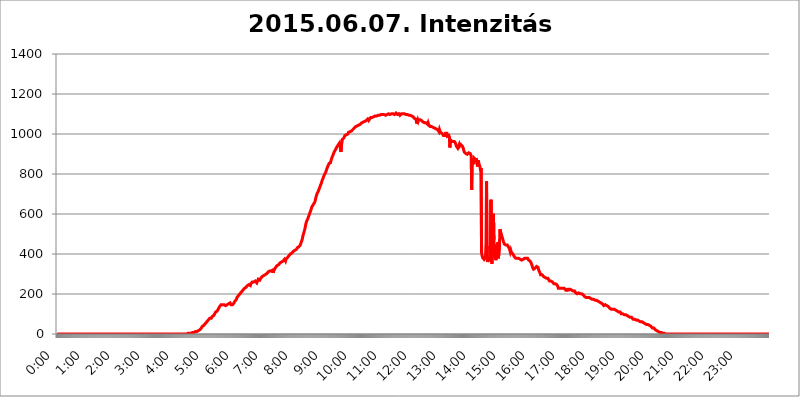
| Category | 2015.06.07. Intenzitás [W/m^2] |
|---|---|
| 0.0 | 0 |
| 0.0006944444444444445 | 0 |
| 0.001388888888888889 | 0 |
| 0.0020833333333333333 | 0 |
| 0.002777777777777778 | 0 |
| 0.003472222222222222 | 0 |
| 0.004166666666666667 | 0 |
| 0.004861111111111111 | 0 |
| 0.005555555555555556 | 0 |
| 0.0062499999999999995 | 0 |
| 0.006944444444444444 | 0 |
| 0.007638888888888889 | 0 |
| 0.008333333333333333 | 0 |
| 0.009027777777777779 | 0 |
| 0.009722222222222222 | 0 |
| 0.010416666666666666 | 0 |
| 0.011111111111111112 | 0 |
| 0.011805555555555555 | 0 |
| 0.012499999999999999 | 0 |
| 0.013194444444444444 | 0 |
| 0.013888888888888888 | 0 |
| 0.014583333333333332 | 0 |
| 0.015277777777777777 | 0 |
| 0.015972222222222224 | 0 |
| 0.016666666666666666 | 0 |
| 0.017361111111111112 | 0 |
| 0.018055555555555557 | 0 |
| 0.01875 | 0 |
| 0.019444444444444445 | 0 |
| 0.02013888888888889 | 0 |
| 0.020833333333333332 | 0 |
| 0.02152777777777778 | 0 |
| 0.022222222222222223 | 0 |
| 0.02291666666666667 | 0 |
| 0.02361111111111111 | 0 |
| 0.024305555555555556 | 0 |
| 0.024999999999999998 | 0 |
| 0.025694444444444447 | 0 |
| 0.02638888888888889 | 0 |
| 0.027083333333333334 | 0 |
| 0.027777777777777776 | 0 |
| 0.02847222222222222 | 0 |
| 0.029166666666666664 | 0 |
| 0.029861111111111113 | 0 |
| 0.030555555555555555 | 0 |
| 0.03125 | 0 |
| 0.03194444444444445 | 0 |
| 0.03263888888888889 | 0 |
| 0.03333333333333333 | 0 |
| 0.034027777777777775 | 0 |
| 0.034722222222222224 | 0 |
| 0.035416666666666666 | 0 |
| 0.036111111111111115 | 0 |
| 0.03680555555555556 | 0 |
| 0.0375 | 0 |
| 0.03819444444444444 | 0 |
| 0.03888888888888889 | 0 |
| 0.03958333333333333 | 0 |
| 0.04027777777777778 | 0 |
| 0.04097222222222222 | 0 |
| 0.041666666666666664 | 0 |
| 0.042361111111111106 | 0 |
| 0.04305555555555556 | 0 |
| 0.043750000000000004 | 0 |
| 0.044444444444444446 | 0 |
| 0.04513888888888889 | 0 |
| 0.04583333333333334 | 0 |
| 0.04652777777777778 | 0 |
| 0.04722222222222222 | 0 |
| 0.04791666666666666 | 0 |
| 0.04861111111111111 | 0 |
| 0.049305555555555554 | 0 |
| 0.049999999999999996 | 0 |
| 0.05069444444444445 | 0 |
| 0.051388888888888894 | 0 |
| 0.052083333333333336 | 0 |
| 0.05277777777777778 | 0 |
| 0.05347222222222222 | 0 |
| 0.05416666666666667 | 0 |
| 0.05486111111111111 | 0 |
| 0.05555555555555555 | 0 |
| 0.05625 | 0 |
| 0.05694444444444444 | 0 |
| 0.057638888888888885 | 0 |
| 0.05833333333333333 | 0 |
| 0.05902777777777778 | 0 |
| 0.059722222222222225 | 0 |
| 0.06041666666666667 | 0 |
| 0.061111111111111116 | 0 |
| 0.06180555555555556 | 0 |
| 0.0625 | 0 |
| 0.06319444444444444 | 0 |
| 0.06388888888888888 | 0 |
| 0.06458333333333334 | 0 |
| 0.06527777777777778 | 0 |
| 0.06597222222222222 | 0 |
| 0.06666666666666667 | 0 |
| 0.06736111111111111 | 0 |
| 0.06805555555555555 | 0 |
| 0.06874999999999999 | 0 |
| 0.06944444444444443 | 0 |
| 0.07013888888888889 | 0 |
| 0.07083333333333333 | 0 |
| 0.07152777777777779 | 0 |
| 0.07222222222222223 | 0 |
| 0.07291666666666667 | 0 |
| 0.07361111111111111 | 0 |
| 0.07430555555555556 | 0 |
| 0.075 | 0 |
| 0.07569444444444444 | 0 |
| 0.0763888888888889 | 0 |
| 0.07708333333333334 | 0 |
| 0.07777777777777778 | 0 |
| 0.07847222222222222 | 0 |
| 0.07916666666666666 | 0 |
| 0.0798611111111111 | 0 |
| 0.08055555555555556 | 0 |
| 0.08125 | 0 |
| 0.08194444444444444 | 0 |
| 0.08263888888888889 | 0 |
| 0.08333333333333333 | 0 |
| 0.08402777777777777 | 0 |
| 0.08472222222222221 | 0 |
| 0.08541666666666665 | 0 |
| 0.08611111111111112 | 0 |
| 0.08680555555555557 | 0 |
| 0.08750000000000001 | 0 |
| 0.08819444444444445 | 0 |
| 0.08888888888888889 | 0 |
| 0.08958333333333333 | 0 |
| 0.09027777777777778 | 0 |
| 0.09097222222222222 | 0 |
| 0.09166666666666667 | 0 |
| 0.09236111111111112 | 0 |
| 0.09305555555555556 | 0 |
| 0.09375 | 0 |
| 0.09444444444444444 | 0 |
| 0.09513888888888888 | 0 |
| 0.09583333333333333 | 0 |
| 0.09652777777777777 | 0 |
| 0.09722222222222222 | 0 |
| 0.09791666666666667 | 0 |
| 0.09861111111111111 | 0 |
| 0.09930555555555555 | 0 |
| 0.09999999999999999 | 0 |
| 0.10069444444444443 | 0 |
| 0.1013888888888889 | 0 |
| 0.10208333333333335 | 0 |
| 0.10277777777777779 | 0 |
| 0.10347222222222223 | 0 |
| 0.10416666666666667 | 0 |
| 0.10486111111111111 | 0 |
| 0.10555555555555556 | 0 |
| 0.10625 | 0 |
| 0.10694444444444444 | 0 |
| 0.1076388888888889 | 0 |
| 0.10833333333333334 | 0 |
| 0.10902777777777778 | 0 |
| 0.10972222222222222 | 0 |
| 0.1111111111111111 | 0 |
| 0.11180555555555556 | 0 |
| 0.11180555555555556 | 0 |
| 0.1125 | 0 |
| 0.11319444444444444 | 0 |
| 0.11388888888888889 | 0 |
| 0.11458333333333333 | 0 |
| 0.11527777777777777 | 0 |
| 0.11597222222222221 | 0 |
| 0.11666666666666665 | 0 |
| 0.1173611111111111 | 0 |
| 0.11805555555555557 | 0 |
| 0.11944444444444445 | 0 |
| 0.12013888888888889 | 0 |
| 0.12083333333333333 | 0 |
| 0.12152777777777778 | 0 |
| 0.12222222222222223 | 0 |
| 0.12291666666666667 | 0 |
| 0.12291666666666667 | 0 |
| 0.12361111111111112 | 0 |
| 0.12430555555555556 | 0 |
| 0.125 | 0 |
| 0.12569444444444444 | 0 |
| 0.12638888888888888 | 0 |
| 0.12708333333333333 | 0 |
| 0.16875 | 0 |
| 0.12847222222222224 | 0 |
| 0.12916666666666668 | 0 |
| 0.12986111111111112 | 0 |
| 0.13055555555555556 | 0 |
| 0.13125 | 0 |
| 0.13194444444444445 | 0 |
| 0.1326388888888889 | 0 |
| 0.13333333333333333 | 0 |
| 0.13402777777777777 | 0 |
| 0.13402777777777777 | 0 |
| 0.13472222222222222 | 0 |
| 0.13541666666666666 | 0 |
| 0.1361111111111111 | 0 |
| 0.13749999999999998 | 0 |
| 0.13819444444444443 | 0 |
| 0.1388888888888889 | 0 |
| 0.13958333333333334 | 0 |
| 0.14027777777777778 | 0 |
| 0.14097222222222222 | 0 |
| 0.14166666666666666 | 0 |
| 0.1423611111111111 | 0 |
| 0.14305555555555557 | 0 |
| 0.14375000000000002 | 0 |
| 0.14444444444444446 | 0 |
| 0.1451388888888889 | 0 |
| 0.1451388888888889 | 0 |
| 0.14652777777777778 | 0 |
| 0.14722222222222223 | 0 |
| 0.14791666666666667 | 0 |
| 0.1486111111111111 | 0 |
| 0.14930555555555555 | 0 |
| 0.15 | 0 |
| 0.15069444444444444 | 0 |
| 0.15138888888888888 | 0 |
| 0.15208333333333332 | 0 |
| 0.15277777777777776 | 0 |
| 0.15347222222222223 | 0 |
| 0.15416666666666667 | 0 |
| 0.15486111111111112 | 0 |
| 0.15555555555555556 | 0 |
| 0.15625 | 0 |
| 0.15694444444444444 | 0 |
| 0.15763888888888888 | 0 |
| 0.15833333333333333 | 0 |
| 0.15902777777777777 | 0 |
| 0.15972222222222224 | 0 |
| 0.16041666666666668 | 0 |
| 0.16111111111111112 | 0 |
| 0.16180555555555556 | 0 |
| 0.1625 | 0 |
| 0.16319444444444445 | 0 |
| 0.1638888888888889 | 0 |
| 0.16458333333333333 | 0 |
| 0.16527777777777777 | 0 |
| 0.16597222222222222 | 0 |
| 0.16666666666666666 | 0 |
| 0.1673611111111111 | 0 |
| 0.16805555555555554 | 0 |
| 0.16874999999999998 | 0 |
| 0.16944444444444443 | 0 |
| 0.17013888888888887 | 0 |
| 0.1708333333333333 | 0 |
| 0.17152777777777775 | 0 |
| 0.17222222222222225 | 0 |
| 0.1729166666666667 | 0 |
| 0.17361111111111113 | 0 |
| 0.17430555555555557 | 0 |
| 0.17500000000000002 | 0 |
| 0.17569444444444446 | 0 |
| 0.1763888888888889 | 0 |
| 0.17708333333333334 | 0 |
| 0.17777777777777778 | 0 |
| 0.17847222222222223 | 0 |
| 0.17916666666666667 | 0 |
| 0.1798611111111111 | 0 |
| 0.18055555555555555 | 0 |
| 0.18125 | 0 |
| 0.18194444444444444 | 0 |
| 0.1826388888888889 | 0 |
| 0.18333333333333335 | 3.525 |
| 0.1840277777777778 | 3.525 |
| 0.18472222222222223 | 3.525 |
| 0.18541666666666667 | 3.525 |
| 0.18611111111111112 | 3.525 |
| 0.18680555555555556 | 3.525 |
| 0.1875 | 3.525 |
| 0.18819444444444444 | 3.525 |
| 0.18888888888888888 | 3.525 |
| 0.18958333333333333 | 7.887 |
| 0.19027777777777777 | 7.887 |
| 0.1909722222222222 | 7.887 |
| 0.19166666666666665 | 7.887 |
| 0.19236111111111112 | 7.887 |
| 0.19305555555555554 | 7.887 |
| 0.19375 | 12.257 |
| 0.19444444444444445 | 12.257 |
| 0.1951388888888889 | 12.257 |
| 0.19583333333333333 | 12.257 |
| 0.19652777777777777 | 16.636 |
| 0.19722222222222222 | 16.636 |
| 0.19791666666666666 | 16.636 |
| 0.1986111111111111 | 21.024 |
| 0.19930555555555554 | 21.024 |
| 0.19999999999999998 | 21.024 |
| 0.20069444444444443 | 21.024 |
| 0.20138888888888887 | 25.419 |
| 0.2020833333333333 | 29.823 |
| 0.2027777777777778 | 34.234 |
| 0.2034722222222222 | 38.653 |
| 0.2041666666666667 | 38.653 |
| 0.20486111111111113 | 43.079 |
| 0.20555555555555557 | 43.079 |
| 0.20625000000000002 | 47.511 |
| 0.20694444444444446 | 47.511 |
| 0.2076388888888889 | 51.951 |
| 0.20833333333333334 | 56.398 |
| 0.20902777777777778 | 56.398 |
| 0.20972222222222223 | 60.85 |
| 0.21041666666666667 | 65.31 |
| 0.2111111111111111 | 65.31 |
| 0.21180555555555555 | 69.775 |
| 0.2125 | 69.775 |
| 0.21319444444444444 | 74.246 |
| 0.2138888888888889 | 78.722 |
| 0.21458333333333335 | 78.722 |
| 0.2152777777777778 | 78.722 |
| 0.21597222222222223 | 78.722 |
| 0.21666666666666667 | 83.205 |
| 0.21736111111111112 | 87.692 |
| 0.21805555555555556 | 87.692 |
| 0.21875 | 87.692 |
| 0.21944444444444444 | 92.184 |
| 0.22013888888888888 | 96.682 |
| 0.22083333333333333 | 101.184 |
| 0.22152777777777777 | 105.69 |
| 0.2222222222222222 | 110.201 |
| 0.22291666666666665 | 110.201 |
| 0.2236111111111111 | 114.716 |
| 0.22430555555555556 | 114.716 |
| 0.225 | 119.235 |
| 0.22569444444444445 | 123.758 |
| 0.2263888888888889 | 123.758 |
| 0.22708333333333333 | 128.284 |
| 0.22777777777777777 | 137.347 |
| 0.22847222222222222 | 137.347 |
| 0.22916666666666666 | 141.884 |
| 0.2298611111111111 | 146.423 |
| 0.23055555555555554 | 146.423 |
| 0.23124999999999998 | 146.423 |
| 0.23194444444444443 | 146.423 |
| 0.23263888888888887 | 146.423 |
| 0.2333333333333333 | 146.423 |
| 0.2340277777777778 | 146.423 |
| 0.2347222222222222 | 146.423 |
| 0.2354166666666667 | 141.884 |
| 0.23611111111111113 | 141.884 |
| 0.23680555555555557 | 141.884 |
| 0.23750000000000002 | 141.884 |
| 0.23819444444444446 | 146.423 |
| 0.2388888888888889 | 146.423 |
| 0.23958333333333334 | 146.423 |
| 0.24027777777777778 | 150.964 |
| 0.24097222222222223 | 150.964 |
| 0.24166666666666667 | 155.509 |
| 0.2423611111111111 | 155.509 |
| 0.24305555555555555 | 155.509 |
| 0.24375 | 146.423 |
| 0.24444444444444446 | 146.423 |
| 0.24513888888888888 | 146.423 |
| 0.24583333333333335 | 146.423 |
| 0.2465277777777778 | 150.964 |
| 0.24722222222222223 | 150.964 |
| 0.24791666666666667 | 155.509 |
| 0.24861111111111112 | 155.509 |
| 0.24930555555555556 | 164.605 |
| 0.25 | 164.605 |
| 0.25069444444444444 | 169.156 |
| 0.2513888888888889 | 173.709 |
| 0.2520833333333333 | 182.82 |
| 0.25277777777777777 | 187.378 |
| 0.2534722222222222 | 187.378 |
| 0.25416666666666665 | 191.937 |
| 0.2548611111111111 | 191.937 |
| 0.2555555555555556 | 196.497 |
| 0.25625000000000003 | 201.058 |
| 0.2569444444444445 | 205.62 |
| 0.2576388888888889 | 205.62 |
| 0.25833333333333336 | 210.182 |
| 0.2590277777777778 | 214.746 |
| 0.25972222222222224 | 214.746 |
| 0.2604166666666667 | 219.309 |
| 0.2611111111111111 | 219.309 |
| 0.26180555555555557 | 223.873 |
| 0.2625 | 228.436 |
| 0.26319444444444445 | 228.436 |
| 0.2638888888888889 | 228.436 |
| 0.26458333333333334 | 233 |
| 0.2652777777777778 | 233 |
| 0.2659722222222222 | 237.564 |
| 0.26666666666666666 | 242.127 |
| 0.2673611111111111 | 242.127 |
| 0.26805555555555555 | 246.689 |
| 0.26875 | 246.689 |
| 0.26944444444444443 | 242.127 |
| 0.2701388888888889 | 242.127 |
| 0.2708333333333333 | 242.127 |
| 0.27152777777777776 | 251.251 |
| 0.2722222222222222 | 255.813 |
| 0.27291666666666664 | 255.813 |
| 0.2736111111111111 | 260.373 |
| 0.2743055555555555 | 260.373 |
| 0.27499999999999997 | 260.373 |
| 0.27569444444444446 | 260.373 |
| 0.27638888888888885 | 260.373 |
| 0.27708333333333335 | 260.373 |
| 0.2777777777777778 | 264.932 |
| 0.27847222222222223 | 269.49 |
| 0.2791666666666667 | 260.373 |
| 0.2798611111111111 | 255.813 |
| 0.28055555555555556 | 260.373 |
| 0.28125 | 260.373 |
| 0.28194444444444444 | 274.047 |
| 0.2826388888888889 | 269.49 |
| 0.2833333333333333 | 274.047 |
| 0.28402777777777777 | 269.49 |
| 0.2847222222222222 | 269.49 |
| 0.28541666666666665 | 278.603 |
| 0.28611111111111115 | 283.156 |
| 0.28680555555555554 | 283.156 |
| 0.28750000000000003 | 287.709 |
| 0.2881944444444445 | 287.709 |
| 0.2888888888888889 | 287.709 |
| 0.28958333333333336 | 292.259 |
| 0.2902777777777778 | 292.259 |
| 0.29097222222222224 | 296.808 |
| 0.2916666666666667 | 296.808 |
| 0.2923611111111111 | 296.808 |
| 0.29305555555555557 | 301.354 |
| 0.29375 | 301.354 |
| 0.29444444444444445 | 305.898 |
| 0.2951388888888889 | 305.898 |
| 0.29583333333333334 | 310.44 |
| 0.2965277777777778 | 314.98 |
| 0.2972222222222222 | 314.98 |
| 0.29791666666666666 | 314.98 |
| 0.2986111111111111 | 314.98 |
| 0.29930555555555555 | 314.98 |
| 0.3 | 314.98 |
| 0.30069444444444443 | 319.517 |
| 0.3013888888888889 | 314.98 |
| 0.3020833333333333 | 319.517 |
| 0.30277777777777776 | 305.898 |
| 0.3034722222222222 | 314.98 |
| 0.30416666666666664 | 314.98 |
| 0.3048611111111111 | 324.052 |
| 0.3055555555555555 | 328.584 |
| 0.30624999999999997 | 333.113 |
| 0.3069444444444444 | 333.113 |
| 0.3076388888888889 | 337.639 |
| 0.30833333333333335 | 342.162 |
| 0.3090277777777778 | 342.162 |
| 0.30972222222222223 | 346.682 |
| 0.3104166666666667 | 346.682 |
| 0.3111111111111111 | 351.198 |
| 0.31180555555555556 | 351.198 |
| 0.3125 | 355.712 |
| 0.31319444444444444 | 355.712 |
| 0.3138888888888889 | 355.712 |
| 0.3145833333333333 | 360.221 |
| 0.31527777777777777 | 364.728 |
| 0.3159722222222222 | 364.728 |
| 0.31666666666666665 | 364.728 |
| 0.31736111111111115 | 369.23 |
| 0.31805555555555554 | 369.23 |
| 0.31875000000000003 | 373.729 |
| 0.3194444444444445 | 378.224 |
| 0.3201388888888889 | 364.728 |
| 0.32083333333333336 | 373.729 |
| 0.3215277777777778 | 378.224 |
| 0.32222222222222224 | 378.224 |
| 0.3229166666666667 | 382.715 |
| 0.3236111111111111 | 382.715 |
| 0.32430555555555557 | 387.202 |
| 0.325 | 391.685 |
| 0.32569444444444445 | 387.202 |
| 0.3263888888888889 | 387.202 |
| 0.32708333333333334 | 400.638 |
| 0.3277777777777778 | 405.108 |
| 0.3284722222222222 | 405.108 |
| 0.32916666666666666 | 405.108 |
| 0.3298611111111111 | 409.574 |
| 0.33055555555555555 | 409.574 |
| 0.33125 | 414.035 |
| 0.33194444444444443 | 414.035 |
| 0.3326388888888889 | 414.035 |
| 0.3333333333333333 | 418.492 |
| 0.3340277777777778 | 418.492 |
| 0.3347222222222222 | 422.943 |
| 0.3354166666666667 | 422.943 |
| 0.3361111111111111 | 427.39 |
| 0.3368055555555556 | 431.833 |
| 0.33749999999999997 | 431.833 |
| 0.33819444444444446 | 431.833 |
| 0.33888888888888885 | 436.27 |
| 0.33958333333333335 | 440.702 |
| 0.34027777777777773 | 440.702 |
| 0.34097222222222223 | 445.129 |
| 0.3416666666666666 | 453.968 |
| 0.3423611111111111 | 458.38 |
| 0.3430555555555555 | 467.187 |
| 0.34375 | 475.972 |
| 0.3444444444444445 | 489.108 |
| 0.3451388888888889 | 497.836 |
| 0.3458333333333334 | 506.542 |
| 0.34652777777777777 | 510.885 |
| 0.34722222222222227 | 523.88 |
| 0.34791666666666665 | 536.82 |
| 0.34861111111111115 | 549.704 |
| 0.34930555555555554 | 553.986 |
| 0.35000000000000003 | 566.793 |
| 0.3506944444444444 | 566.793 |
| 0.3513888888888889 | 575.299 |
| 0.3520833333333333 | 583.779 |
| 0.3527777777777778 | 588.009 |
| 0.3534722222222222 | 596.45 |
| 0.3541666666666667 | 604.864 |
| 0.3548611111111111 | 609.062 |
| 0.35555555555555557 | 617.436 |
| 0.35625 | 625.784 |
| 0.35694444444444445 | 634.105 |
| 0.3576388888888889 | 638.256 |
| 0.35833333333333334 | 642.4 |
| 0.3590277777777778 | 646.537 |
| 0.3597222222222222 | 650.667 |
| 0.36041666666666666 | 654.791 |
| 0.3611111111111111 | 658.909 |
| 0.36180555555555555 | 667.123 |
| 0.3625 | 679.395 |
| 0.36319444444444443 | 687.544 |
| 0.3638888888888889 | 695.666 |
| 0.3645833333333333 | 703.762 |
| 0.3652777777777778 | 707.8 |
| 0.3659722222222222 | 711.832 |
| 0.3666666666666667 | 719.877 |
| 0.3673611111111111 | 723.889 |
| 0.3680555555555556 | 731.896 |
| 0.36874999999999997 | 739.877 |
| 0.36944444444444446 | 743.859 |
| 0.37013888888888885 | 751.803 |
| 0.37083333333333335 | 759.723 |
| 0.37152777777777773 | 767.62 |
| 0.37222222222222223 | 771.559 |
| 0.3729166666666666 | 779.42 |
| 0.3736111111111111 | 787.258 |
| 0.3743055555555555 | 791.169 |
| 0.375 | 798.974 |
| 0.3756944444444445 | 802.868 |
| 0.3763888888888889 | 806.757 |
| 0.3770833333333334 | 810.641 |
| 0.37777777777777777 | 822.26 |
| 0.37847222222222227 | 829.981 |
| 0.37916666666666665 | 833.834 |
| 0.37986111111111115 | 841.526 |
| 0.38055555555555554 | 845.365 |
| 0.38125000000000003 | 853.029 |
| 0.3819444444444444 | 853.029 |
| 0.3826388888888889 | 853.029 |
| 0.3833333333333333 | 856.855 |
| 0.3840277777777778 | 868.305 |
| 0.3847222222222222 | 875.918 |
| 0.3854166666666667 | 883.516 |
| 0.3861111111111111 | 887.309 |
| 0.38680555555555557 | 894.885 |
| 0.3875 | 902.447 |
| 0.38819444444444445 | 906.223 |
| 0.3888888888888889 | 913.766 |
| 0.38958333333333334 | 917.534 |
| 0.3902777777777778 | 921.298 |
| 0.3909722222222222 | 925.06 |
| 0.39166666666666666 | 932.576 |
| 0.3923611111111111 | 936.33 |
| 0.39305555555555555 | 940.082 |
| 0.39375 | 940.082 |
| 0.39444444444444443 | 947.58 |
| 0.3951388888888889 | 951.327 |
| 0.3958333333333333 | 955.071 |
| 0.3965277777777778 | 955.071 |
| 0.3972222222222222 | 951.327 |
| 0.3979166666666667 | 909.996 |
| 0.3986111111111111 | 943.832 |
| 0.3993055555555556 | 958.814 |
| 0.39999999999999997 | 973.772 |
| 0.40069444444444446 | 970.034 |
| 0.40138888888888885 | 973.772 |
| 0.40208333333333335 | 981.244 |
| 0.40277777777777773 | 984.98 |
| 0.40347222222222223 | 992.448 |
| 0.4041666666666666 | 992.448 |
| 0.4048611111111111 | 996.182 |
| 0.4055555555555555 | 996.182 |
| 0.40625 | 996.182 |
| 0.4069444444444445 | 999.916 |
| 0.4076388888888889 | 999.916 |
| 0.4083333333333334 | 1007.383 |
| 0.40902777777777777 | 1007.383 |
| 0.40972222222222227 | 1007.383 |
| 0.41041666666666665 | 1011.118 |
| 0.41111111111111115 | 1011.118 |
| 0.41180555555555554 | 1014.852 |
| 0.41250000000000003 | 1014.852 |
| 0.4131944444444444 | 1014.852 |
| 0.4138888888888889 | 1014.852 |
| 0.4145833333333333 | 1022.323 |
| 0.4152777777777778 | 1022.323 |
| 0.4159722222222222 | 1026.06 |
| 0.4166666666666667 | 1029.798 |
| 0.4173611111111111 | 1029.798 |
| 0.41805555555555557 | 1033.537 |
| 0.41875 | 1037.277 |
| 0.41944444444444445 | 1037.277 |
| 0.4201388888888889 | 1037.277 |
| 0.42083333333333334 | 1041.019 |
| 0.4215277777777778 | 1044.762 |
| 0.4222222222222222 | 1044.762 |
| 0.42291666666666666 | 1044.762 |
| 0.4236111111111111 | 1048.508 |
| 0.42430555555555555 | 1048.508 |
| 0.425 | 1048.508 |
| 0.42569444444444443 | 1048.508 |
| 0.4263888888888889 | 1052.255 |
| 0.4270833333333333 | 1056.004 |
| 0.4277777777777778 | 1059.756 |
| 0.4284722222222222 | 1056.004 |
| 0.4291666666666667 | 1059.756 |
| 0.4298611111111111 | 1063.51 |
| 0.4305555555555556 | 1063.51 |
| 0.43124999999999997 | 1063.51 |
| 0.43194444444444446 | 1067.267 |
| 0.43263888888888885 | 1067.267 |
| 0.43333333333333335 | 1067.267 |
| 0.43402777777777773 | 1071.027 |
| 0.43472222222222223 | 1071.027 |
| 0.4354166666666666 | 1074.789 |
| 0.4361111111111111 | 1074.789 |
| 0.4368055555555555 | 1067.267 |
| 0.4375 | 1067.267 |
| 0.4381944444444445 | 1074.789 |
| 0.4388888888888889 | 1078.555 |
| 0.4395833333333334 | 1082.324 |
| 0.44027777777777777 | 1082.324 |
| 0.44097222222222227 | 1082.324 |
| 0.44166666666666665 | 1082.324 |
| 0.44236111111111115 | 1086.097 |
| 0.44305555555555554 | 1086.097 |
| 0.44375000000000003 | 1086.097 |
| 0.4444444444444444 | 1089.873 |
| 0.4451388888888889 | 1089.873 |
| 0.4458333333333333 | 1089.873 |
| 0.4465277777777778 | 1089.873 |
| 0.4472222222222222 | 1089.873 |
| 0.4479166666666667 | 1089.873 |
| 0.4486111111111111 | 1089.873 |
| 0.44930555555555557 | 1093.653 |
| 0.45 | 1093.653 |
| 0.45069444444444445 | 1093.653 |
| 0.4513888888888889 | 1097.437 |
| 0.45208333333333334 | 1093.653 |
| 0.4527777777777778 | 1097.437 |
| 0.4534722222222222 | 1097.437 |
| 0.45416666666666666 | 1097.437 |
| 0.4548611111111111 | 1097.437 |
| 0.45555555555555555 | 1097.437 |
| 0.45625 | 1097.437 |
| 0.45694444444444443 | 1097.437 |
| 0.4576388888888889 | 1097.437 |
| 0.4583333333333333 | 1097.437 |
| 0.4590277777777778 | 1097.437 |
| 0.4597222222222222 | 1097.437 |
| 0.4604166666666667 | 1093.653 |
| 0.4611111111111111 | 1093.653 |
| 0.4618055555555556 | 1093.653 |
| 0.46249999999999997 | 1097.437 |
| 0.46319444444444446 | 1097.437 |
| 0.46388888888888885 | 1101.226 |
| 0.46458333333333335 | 1101.226 |
| 0.46527777777777773 | 1101.226 |
| 0.46597222222222223 | 1101.226 |
| 0.4666666666666666 | 1097.437 |
| 0.4673611111111111 | 1101.226 |
| 0.4680555555555555 | 1101.226 |
| 0.46875 | 1101.226 |
| 0.4694444444444445 | 1101.226 |
| 0.4701388888888889 | 1101.226 |
| 0.4708333333333334 | 1101.226 |
| 0.47152777777777777 | 1101.226 |
| 0.47222222222222227 | 1097.437 |
| 0.47291666666666665 | 1097.437 |
| 0.47361111111111115 | 1101.226 |
| 0.47430555555555554 | 1101.226 |
| 0.47500000000000003 | 1105.019 |
| 0.4756944444444444 | 1105.019 |
| 0.4763888888888889 | 1101.226 |
| 0.4770833333333333 | 1097.437 |
| 0.4777777777777778 | 1097.437 |
| 0.4784722222222222 | 1101.226 |
| 0.4791666666666667 | 1101.226 |
| 0.4798611111111111 | 1097.437 |
| 0.48055555555555557 | 1093.653 |
| 0.48125 | 1093.653 |
| 0.48194444444444445 | 1097.437 |
| 0.4826388888888889 | 1101.226 |
| 0.48333333333333334 | 1105.019 |
| 0.4840277777777778 | 1105.019 |
| 0.4847222222222222 | 1101.226 |
| 0.48541666666666666 | 1101.226 |
| 0.4861111111111111 | 1101.226 |
| 0.48680555555555555 | 1101.226 |
| 0.4875 | 1097.437 |
| 0.48819444444444443 | 1097.437 |
| 0.4888888888888889 | 1097.437 |
| 0.4895833333333333 | 1097.437 |
| 0.4902777777777778 | 1097.437 |
| 0.4909722222222222 | 1097.437 |
| 0.4916666666666667 | 1097.437 |
| 0.4923611111111111 | 1093.653 |
| 0.4930555555555556 | 1093.653 |
| 0.49374999999999997 | 1093.653 |
| 0.49444444444444446 | 1093.653 |
| 0.49513888888888885 | 1093.653 |
| 0.49583333333333335 | 1093.653 |
| 0.49652777777777773 | 1089.873 |
| 0.49722222222222223 | 1089.873 |
| 0.4979166666666666 | 1086.097 |
| 0.4986111111111111 | 1086.097 |
| 0.4993055555555555 | 1086.097 |
| 0.5 | 1086.097 |
| 0.5006944444444444 | 1078.555 |
| 0.5013888888888889 | 1078.555 |
| 0.5020833333333333 | 1078.555 |
| 0.5027777777777778 | 1074.789 |
| 0.5034722222222222 | 1067.267 |
| 0.5041666666666667 | 1052.255 |
| 0.5048611111111111 | 1063.51 |
| 0.5055555555555555 | 1071.027 |
| 0.50625 | 1063.51 |
| 0.5069444444444444 | 1071.027 |
| 0.5076388888888889 | 1074.789 |
| 0.5083333333333333 | 1074.789 |
| 0.5090277777777777 | 1071.027 |
| 0.5097222222222222 | 1074.789 |
| 0.5104166666666666 | 1071.027 |
| 0.5111111111111112 | 1067.267 |
| 0.5118055555555555 | 1067.267 |
| 0.5125000000000001 | 1063.51 |
| 0.5131944444444444 | 1059.756 |
| 0.513888888888889 | 1056.004 |
| 0.5145833333333333 | 1056.004 |
| 0.5152777777777778 | 1056.004 |
| 0.5159722222222222 | 1056.004 |
| 0.5166666666666667 | 1056.004 |
| 0.517361111111111 | 1056.004 |
| 0.5180555555555556 | 1056.004 |
| 0.5187499999999999 | 1056.004 |
| 0.5194444444444445 | 1048.508 |
| 0.5201388888888888 | 1056.004 |
| 0.5208333333333334 | 1048.508 |
| 0.5215277777777778 | 1044.762 |
| 0.5222222222222223 | 1044.762 |
| 0.5229166666666667 | 1037.277 |
| 0.5236111111111111 | 1037.277 |
| 0.5243055555555556 | 1037.277 |
| 0.525 | 1037.277 |
| 0.5256944444444445 | 1033.537 |
| 0.5263888888888889 | 1037.277 |
| 0.5270833333333333 | 1033.537 |
| 0.5277777777777778 | 1033.537 |
| 0.5284722222222222 | 1033.537 |
| 0.5291666666666667 | 1029.798 |
| 0.5298611111111111 | 1029.798 |
| 0.5305555555555556 | 1026.06 |
| 0.53125 | 1026.06 |
| 0.5319444444444444 | 1026.06 |
| 0.5326388888888889 | 1022.323 |
| 0.5333333333333333 | 1022.323 |
| 0.5340277777777778 | 1022.323 |
| 0.5347222222222222 | 1022.323 |
| 0.5354166666666667 | 1011.118 |
| 0.5361111111111111 | 1022.323 |
| 0.5368055555555555 | 1018.587 |
| 0.5375 | 1007.383 |
| 0.5381944444444444 | 1007.383 |
| 0.5388888888888889 | 1003.65 |
| 0.5395833333333333 | 1003.65 |
| 0.5402777777777777 | 999.916 |
| 0.5409722222222222 | 999.916 |
| 0.5416666666666666 | 992.448 |
| 0.5423611111111112 | 996.182 |
| 0.5430555555555555 | 992.448 |
| 0.5437500000000001 | 992.448 |
| 0.5444444444444444 | 1003.65 |
| 0.545138888888889 | 1007.383 |
| 0.5458333333333333 | 1007.383 |
| 0.5465277777777778 | 1003.65 |
| 0.5472222222222222 | 988.714 |
| 0.5479166666666667 | 984.98 |
| 0.548611111111111 | 992.448 |
| 0.5493055555555556 | 992.448 |
| 0.5499999999999999 | 984.98 |
| 0.5506944444444445 | 932.576 |
| 0.5513888888888888 | 973.772 |
| 0.5520833333333334 | 970.034 |
| 0.5527777777777778 | 962.555 |
| 0.5534722222222223 | 966.295 |
| 0.5541666666666667 | 962.555 |
| 0.5548611111111111 | 962.555 |
| 0.5555555555555556 | 962.555 |
| 0.55625 | 962.555 |
| 0.5569444444444445 | 962.555 |
| 0.5576388888888889 | 962.555 |
| 0.5583333333333333 | 955.071 |
| 0.5590277777777778 | 947.58 |
| 0.5597222222222222 | 940.082 |
| 0.5604166666666667 | 940.082 |
| 0.5611111111111111 | 940.082 |
| 0.5618055555555556 | 928.819 |
| 0.5625 | 928.819 |
| 0.5631944444444444 | 940.082 |
| 0.5638888888888889 | 947.58 |
| 0.5645833333333333 | 940.082 |
| 0.5652777777777778 | 940.082 |
| 0.5659722222222222 | 947.58 |
| 0.5666666666666667 | 951.327 |
| 0.5673611111111111 | 947.58 |
| 0.5680555555555555 | 940.082 |
| 0.56875 | 936.33 |
| 0.5694444444444444 | 928.819 |
| 0.5701388888888889 | 917.534 |
| 0.5708333333333333 | 909.996 |
| 0.5715277777777777 | 906.223 |
| 0.5722222222222222 | 906.223 |
| 0.5729166666666666 | 902.447 |
| 0.5736111111111112 | 902.447 |
| 0.5743055555555555 | 898.668 |
| 0.5750000000000001 | 898.668 |
| 0.5756944444444444 | 894.885 |
| 0.576388888888889 | 898.668 |
| 0.5770833333333333 | 906.223 |
| 0.5777777777777778 | 902.447 |
| 0.5784722222222222 | 902.447 |
| 0.5791666666666667 | 902.447 |
| 0.579861111111111 | 902.447 |
| 0.5805555555555556 | 891.099 |
| 0.5812499999999999 | 719.877 |
| 0.5819444444444445 | 875.918 |
| 0.5826388888888888 | 879.719 |
| 0.5833333333333334 | 849.199 |
| 0.5840277777777778 | 864.493 |
| 0.5847222222222223 | 879.719 |
| 0.5854166666666667 | 883.516 |
| 0.5861111111111111 | 883.516 |
| 0.5868055555555556 | 872.114 |
| 0.5875 | 879.719 |
| 0.5881944444444445 | 879.719 |
| 0.5888888888888889 | 875.918 |
| 0.5895833333333333 | 837.682 |
| 0.5902777777777778 | 868.305 |
| 0.5909722222222222 | 860.676 |
| 0.5916666666666667 | 849.199 |
| 0.5923611111111111 | 849.199 |
| 0.5930555555555556 | 833.834 |
| 0.59375 | 814.519 |
| 0.5944444444444444 | 829.981 |
| 0.5951388888888889 | 405.108 |
| 0.5958333333333333 | 391.685 |
| 0.5965277777777778 | 382.715 |
| 0.5972222222222222 | 382.715 |
| 0.5979166666666667 | 378.224 |
| 0.5986111111111111 | 373.729 |
| 0.5993055555555555 | 378.224 |
| 0.6 | 378.224 |
| 0.6006944444444444 | 387.202 |
| 0.6013888888888889 | 458.38 |
| 0.6020833333333333 | 763.674 |
| 0.6027777777777777 | 373.729 |
| 0.6034722222222222 | 360.221 |
| 0.6041666666666666 | 369.23 |
| 0.6048611111111112 | 364.728 |
| 0.6055555555555555 | 369.23 |
| 0.6062500000000001 | 369.23 |
| 0.6069444444444444 | 440.702 |
| 0.607638888888889 | 405.108 |
| 0.6083333333333333 | 671.22 |
| 0.6090277777777778 | 364.728 |
| 0.6097222222222222 | 351.198 |
| 0.6104166666666667 | 346.682 |
| 0.611111111111111 | 351.198 |
| 0.6118055555555556 | 600.661 |
| 0.6124999999999999 | 471.582 |
| 0.6131944444444445 | 396.164 |
| 0.6138888888888888 | 387.202 |
| 0.6145833333333334 | 378.224 |
| 0.6152777777777778 | 369.23 |
| 0.6159722222222223 | 373.729 |
| 0.6166666666666667 | 449.551 |
| 0.6173611111111111 | 409.574 |
| 0.6180555555555556 | 458.38 |
| 0.61875 | 378.224 |
| 0.6194444444444445 | 373.729 |
| 0.6201388888888889 | 436.27 |
| 0.6208333333333333 | 523.88 |
| 0.6215277777777778 | 515.223 |
| 0.6222222222222222 | 506.542 |
| 0.6229166666666667 | 497.836 |
| 0.6236111111111111 | 489.108 |
| 0.6243055555555556 | 480.356 |
| 0.625 | 475.972 |
| 0.6256944444444444 | 462.786 |
| 0.6263888888888889 | 458.38 |
| 0.6270833333333333 | 449.551 |
| 0.6277777777777778 | 449.551 |
| 0.6284722222222222 | 445.129 |
| 0.6291666666666667 | 445.129 |
| 0.6298611111111111 | 445.129 |
| 0.6305555555555555 | 445.129 |
| 0.63125 | 445.129 |
| 0.6319444444444444 | 440.702 |
| 0.6326388888888889 | 436.27 |
| 0.6333333333333333 | 431.833 |
| 0.6340277777777777 | 427.39 |
| 0.6347222222222222 | 422.943 |
| 0.6354166666666666 | 409.574 |
| 0.6361111111111112 | 418.492 |
| 0.6368055555555555 | 409.574 |
| 0.6375000000000001 | 409.574 |
| 0.6381944444444444 | 405.108 |
| 0.638888888888889 | 400.638 |
| 0.6395833333333333 | 400.638 |
| 0.6402777777777778 | 396.164 |
| 0.6409722222222222 | 387.202 |
| 0.6416666666666667 | 387.202 |
| 0.642361111111111 | 382.715 |
| 0.6430555555555556 | 378.224 |
| 0.6437499999999999 | 382.715 |
| 0.6444444444444445 | 378.224 |
| 0.6451388888888888 | 378.224 |
| 0.6458333333333334 | 378.224 |
| 0.6465277777777778 | 378.224 |
| 0.6472222222222223 | 378.224 |
| 0.6479166666666667 | 373.729 |
| 0.6486111111111111 | 373.729 |
| 0.6493055555555556 | 373.729 |
| 0.65 | 369.23 |
| 0.6506944444444445 | 369.23 |
| 0.6513888888888889 | 369.23 |
| 0.6520833333333333 | 369.23 |
| 0.6527777777777778 | 369.23 |
| 0.6534722222222222 | 373.729 |
| 0.6541666666666667 | 373.729 |
| 0.6548611111111111 | 378.224 |
| 0.6555555555555556 | 378.224 |
| 0.65625 | 378.224 |
| 0.6569444444444444 | 378.224 |
| 0.6576388888888889 | 378.224 |
| 0.6583333333333333 | 378.224 |
| 0.6590277777777778 | 378.224 |
| 0.6597222222222222 | 378.224 |
| 0.6604166666666667 | 378.224 |
| 0.6611111111111111 | 369.23 |
| 0.6618055555555555 | 369.23 |
| 0.6625 | 369.23 |
| 0.6631944444444444 | 364.728 |
| 0.6638888888888889 | 360.221 |
| 0.6645833333333333 | 355.712 |
| 0.6652777777777777 | 351.198 |
| 0.6659722222222222 | 342.162 |
| 0.6666666666666666 | 333.113 |
| 0.6673611111111111 | 333.113 |
| 0.6680555555555556 | 324.052 |
| 0.6687500000000001 | 324.052 |
| 0.6694444444444444 | 324.052 |
| 0.6701388888888888 | 328.584 |
| 0.6708333333333334 | 333.113 |
| 0.6715277777777778 | 333.113 |
| 0.6722222222222222 | 337.639 |
| 0.6729166666666666 | 337.639 |
| 0.6736111111111112 | 337.639 |
| 0.6743055555555556 | 333.113 |
| 0.6749999999999999 | 324.052 |
| 0.6756944444444444 | 314.98 |
| 0.6763888888888889 | 314.98 |
| 0.6770833333333334 | 305.898 |
| 0.6777777777777777 | 296.808 |
| 0.6784722222222223 | 301.354 |
| 0.6791666666666667 | 296.808 |
| 0.6798611111111111 | 296.808 |
| 0.6805555555555555 | 296.808 |
| 0.68125 | 292.259 |
| 0.6819444444444445 | 287.709 |
| 0.6826388888888889 | 287.709 |
| 0.6833333333333332 | 287.709 |
| 0.6840277777777778 | 283.156 |
| 0.6847222222222222 | 283.156 |
| 0.6854166666666667 | 278.603 |
| 0.686111111111111 | 278.603 |
| 0.6868055555555556 | 278.603 |
| 0.6875 | 278.603 |
| 0.6881944444444444 | 278.603 |
| 0.688888888888889 | 274.047 |
| 0.6895833333333333 | 274.047 |
| 0.6902777777777778 | 264.932 |
| 0.6909722222222222 | 264.932 |
| 0.6916666666666668 | 269.49 |
| 0.6923611111111111 | 264.932 |
| 0.6930555555555555 | 264.932 |
| 0.69375 | 260.373 |
| 0.6944444444444445 | 260.373 |
| 0.6951388888888889 | 260.373 |
| 0.6958333333333333 | 260.373 |
| 0.6965277777777777 | 251.251 |
| 0.6972222222222223 | 255.813 |
| 0.6979166666666666 | 255.813 |
| 0.6986111111111111 | 251.251 |
| 0.6993055555555556 | 251.251 |
| 0.7000000000000001 | 251.251 |
| 0.7006944444444444 | 246.689 |
| 0.7013888888888888 | 242.127 |
| 0.7020833333333334 | 237.564 |
| 0.7027777777777778 | 228.436 |
| 0.7034722222222222 | 233 |
| 0.7041666666666666 | 228.436 |
| 0.7048611111111112 | 228.436 |
| 0.7055555555555556 | 228.436 |
| 0.7062499999999999 | 228.436 |
| 0.7069444444444444 | 228.436 |
| 0.7076388888888889 | 228.436 |
| 0.7083333333333334 | 228.436 |
| 0.7090277777777777 | 228.436 |
| 0.7097222222222223 | 233 |
| 0.7104166666666667 | 233 |
| 0.7111111111111111 | 228.436 |
| 0.7118055555555555 | 223.873 |
| 0.7125 | 228.436 |
| 0.7131944444444445 | 219.309 |
| 0.7138888888888889 | 219.309 |
| 0.7145833333333332 | 219.309 |
| 0.7152777777777778 | 219.309 |
| 0.7159722222222222 | 228.436 |
| 0.7166666666666667 | 214.746 |
| 0.717361111111111 | 223.873 |
| 0.7180555555555556 | 219.309 |
| 0.71875 | 223.873 |
| 0.7194444444444444 | 223.873 |
| 0.720138888888889 | 219.309 |
| 0.7208333333333333 | 219.309 |
| 0.7215277777777778 | 219.309 |
| 0.7222222222222222 | 219.309 |
| 0.7229166666666668 | 214.746 |
| 0.7236111111111111 | 214.746 |
| 0.7243055555555555 | 214.746 |
| 0.725 | 214.746 |
| 0.7256944444444445 | 214.746 |
| 0.7263888888888889 | 210.182 |
| 0.7270833333333333 | 205.62 |
| 0.7277777777777777 | 201.058 |
| 0.7284722222222223 | 201.058 |
| 0.7291666666666666 | 201.058 |
| 0.7298611111111111 | 201.058 |
| 0.7305555555555556 | 205.62 |
| 0.7312500000000001 | 205.62 |
| 0.7319444444444444 | 201.058 |
| 0.7326388888888888 | 201.058 |
| 0.7333333333333334 | 201.058 |
| 0.7340277777777778 | 201.058 |
| 0.7347222222222222 | 201.058 |
| 0.7354166666666666 | 201.058 |
| 0.7361111111111112 | 196.497 |
| 0.7368055555555556 | 196.497 |
| 0.7374999999999999 | 196.497 |
| 0.7381944444444444 | 191.937 |
| 0.7388888888888889 | 191.937 |
| 0.7395833333333334 | 187.378 |
| 0.7402777777777777 | 187.378 |
| 0.7409722222222223 | 182.82 |
| 0.7416666666666667 | 182.82 |
| 0.7423611111111111 | 182.82 |
| 0.7430555555555555 | 187.378 |
| 0.74375 | 182.82 |
| 0.7444444444444445 | 182.82 |
| 0.7451388888888889 | 182.82 |
| 0.7458333333333332 | 182.82 |
| 0.7465277777777778 | 178.264 |
| 0.7472222222222222 | 178.264 |
| 0.7479166666666667 | 178.264 |
| 0.748611111111111 | 178.264 |
| 0.7493055555555556 | 173.709 |
| 0.75 | 173.709 |
| 0.7506944444444444 | 173.709 |
| 0.751388888888889 | 173.709 |
| 0.7520833333333333 | 173.709 |
| 0.7527777777777778 | 173.709 |
| 0.7534722222222222 | 169.156 |
| 0.7541666666666668 | 169.156 |
| 0.7548611111111111 | 164.605 |
| 0.7555555555555555 | 164.605 |
| 0.75625 | 169.156 |
| 0.7569444444444445 | 164.605 |
| 0.7576388888888889 | 164.605 |
| 0.7583333333333333 | 164.605 |
| 0.7590277777777777 | 164.605 |
| 0.7597222222222223 | 160.056 |
| 0.7604166666666666 | 160.056 |
| 0.7611111111111111 | 160.056 |
| 0.7618055555555556 | 155.509 |
| 0.7625000000000001 | 155.509 |
| 0.7631944444444444 | 155.509 |
| 0.7638888888888888 | 155.509 |
| 0.7645833333333334 | 150.964 |
| 0.7652777777777778 | 150.964 |
| 0.7659722222222222 | 146.423 |
| 0.7666666666666666 | 141.884 |
| 0.7673611111111112 | 146.423 |
| 0.7680555555555556 | 146.423 |
| 0.7687499999999999 | 146.423 |
| 0.7694444444444444 | 141.884 |
| 0.7701388888888889 | 141.884 |
| 0.7708333333333334 | 141.884 |
| 0.7715277777777777 | 137.347 |
| 0.7722222222222223 | 137.347 |
| 0.7729166666666667 | 137.347 |
| 0.7736111111111111 | 132.814 |
| 0.7743055555555555 | 132.814 |
| 0.775 | 128.284 |
| 0.7756944444444445 | 128.284 |
| 0.7763888888888889 | 123.758 |
| 0.7770833333333332 | 123.758 |
| 0.7777777777777778 | 119.235 |
| 0.7784722222222222 | 123.758 |
| 0.7791666666666667 | 123.758 |
| 0.779861111111111 | 123.758 |
| 0.7805555555555556 | 123.758 |
| 0.78125 | 123.758 |
| 0.7819444444444444 | 119.235 |
| 0.782638888888889 | 119.235 |
| 0.7833333333333333 | 119.235 |
| 0.7840277777777778 | 119.235 |
| 0.7847222222222222 | 114.716 |
| 0.7854166666666668 | 114.716 |
| 0.7861111111111111 | 114.716 |
| 0.7868055555555555 | 114.716 |
| 0.7875 | 110.201 |
| 0.7881944444444445 | 110.201 |
| 0.7888888888888889 | 110.201 |
| 0.7895833333333333 | 110.201 |
| 0.7902777777777777 | 105.69 |
| 0.7909722222222223 | 101.184 |
| 0.7916666666666666 | 101.184 |
| 0.7923611111111111 | 101.184 |
| 0.7930555555555556 | 101.184 |
| 0.7937500000000001 | 101.184 |
| 0.7944444444444444 | 96.682 |
| 0.7951388888888888 | 96.682 |
| 0.7958333333333334 | 96.682 |
| 0.7965277777777778 | 96.682 |
| 0.7972222222222222 | 96.682 |
| 0.7979166666666666 | 92.184 |
| 0.7986111111111112 | 92.184 |
| 0.7993055555555556 | 92.184 |
| 0.7999999999999999 | 87.692 |
| 0.8006944444444444 | 87.692 |
| 0.8013888888888889 | 87.692 |
| 0.8020833333333334 | 87.692 |
| 0.8027777777777777 | 83.205 |
| 0.8034722222222223 | 83.205 |
| 0.8041666666666667 | 83.205 |
| 0.8048611111111111 | 83.205 |
| 0.8055555555555555 | 83.205 |
| 0.80625 | 78.722 |
| 0.8069444444444445 | 78.722 |
| 0.8076388888888889 | 74.246 |
| 0.8083333333333332 | 74.246 |
| 0.8090277777777778 | 74.246 |
| 0.8097222222222222 | 74.246 |
| 0.8104166666666667 | 74.246 |
| 0.811111111111111 | 69.775 |
| 0.8118055555555556 | 69.775 |
| 0.8125 | 69.775 |
| 0.8131944444444444 | 69.775 |
| 0.813888888888889 | 69.775 |
| 0.8145833333333333 | 65.31 |
| 0.8152777777777778 | 65.31 |
| 0.8159722222222222 | 65.31 |
| 0.8166666666666668 | 65.31 |
| 0.8173611111111111 | 65.31 |
| 0.8180555555555555 | 60.85 |
| 0.81875 | 60.85 |
| 0.8194444444444445 | 60.85 |
| 0.8201388888888889 | 60.85 |
| 0.8208333333333333 | 56.398 |
| 0.8215277777777777 | 56.398 |
| 0.8222222222222223 | 56.398 |
| 0.8229166666666666 | 56.398 |
| 0.8236111111111111 | 51.951 |
| 0.8243055555555556 | 51.951 |
| 0.8250000000000001 | 51.951 |
| 0.8256944444444444 | 47.511 |
| 0.8263888888888888 | 47.511 |
| 0.8270833333333334 | 47.511 |
| 0.8277777777777778 | 47.511 |
| 0.8284722222222222 | 47.511 |
| 0.8291666666666666 | 43.079 |
| 0.8298611111111112 | 43.079 |
| 0.8305555555555556 | 43.079 |
| 0.8312499999999999 | 38.653 |
| 0.8319444444444444 | 38.653 |
| 0.8326388888888889 | 38.653 |
| 0.8333333333333334 | 34.234 |
| 0.8340277777777777 | 34.234 |
| 0.8347222222222223 | 29.823 |
| 0.8354166666666667 | 29.823 |
| 0.8361111111111111 | 29.823 |
| 0.8368055555555555 | 29.823 |
| 0.8375 | 25.419 |
| 0.8381944444444445 | 25.419 |
| 0.8388888888888889 | 21.024 |
| 0.8395833333333332 | 21.024 |
| 0.8402777777777778 | 21.024 |
| 0.8409722222222222 | 16.636 |
| 0.8416666666666667 | 16.636 |
| 0.842361111111111 | 12.257 |
| 0.8430555555555556 | 12.257 |
| 0.84375 | 12.257 |
| 0.8444444444444444 | 12.257 |
| 0.845138888888889 | 7.887 |
| 0.8458333333333333 | 7.887 |
| 0.8465277777777778 | 7.887 |
| 0.8472222222222222 | 7.887 |
| 0.8479166666666668 | 3.525 |
| 0.8486111111111111 | 3.525 |
| 0.8493055555555555 | 3.525 |
| 0.85 | 3.525 |
| 0.8506944444444445 | 3.525 |
| 0.8513888888888889 | 3.525 |
| 0.8520833333333333 | 3.525 |
| 0.8527777777777777 | 3.525 |
| 0.8534722222222223 | 0 |
| 0.8541666666666666 | 0 |
| 0.8548611111111111 | 0 |
| 0.8555555555555556 | 0 |
| 0.8562500000000001 | 0 |
| 0.8569444444444444 | 0 |
| 0.8576388888888888 | 0 |
| 0.8583333333333334 | 0 |
| 0.8590277777777778 | 0 |
| 0.8597222222222222 | 0 |
| 0.8604166666666666 | 0 |
| 0.8611111111111112 | 0 |
| 0.8618055555555556 | 0 |
| 0.8624999999999999 | 0 |
| 0.8631944444444444 | 0 |
| 0.8638888888888889 | 0 |
| 0.8645833333333334 | 0 |
| 0.8652777777777777 | 0 |
| 0.8659722222222223 | 0 |
| 0.8666666666666667 | 0 |
| 0.8673611111111111 | 0 |
| 0.8680555555555555 | 0 |
| 0.86875 | 0 |
| 0.8694444444444445 | 0 |
| 0.8701388888888889 | 0 |
| 0.8708333333333332 | 0 |
| 0.8715277777777778 | 0 |
| 0.8722222222222222 | 0 |
| 0.8729166666666667 | 0 |
| 0.873611111111111 | 0 |
| 0.8743055555555556 | 0 |
| 0.875 | 0 |
| 0.8756944444444444 | 0 |
| 0.876388888888889 | 0 |
| 0.8770833333333333 | 0 |
| 0.8777777777777778 | 0 |
| 0.8784722222222222 | 0 |
| 0.8791666666666668 | 0 |
| 0.8798611111111111 | 0 |
| 0.8805555555555555 | 0 |
| 0.88125 | 0 |
| 0.8819444444444445 | 0 |
| 0.8826388888888889 | 0 |
| 0.8833333333333333 | 0 |
| 0.8840277777777777 | 0 |
| 0.8847222222222223 | 0 |
| 0.8854166666666666 | 0 |
| 0.8861111111111111 | 0 |
| 0.8868055555555556 | 0 |
| 0.8875000000000001 | 0 |
| 0.8881944444444444 | 0 |
| 0.8888888888888888 | 0 |
| 0.8895833333333334 | 0 |
| 0.8902777777777778 | 0 |
| 0.8909722222222222 | 0 |
| 0.8916666666666666 | 0 |
| 0.8923611111111112 | 0 |
| 0.8930555555555556 | 0 |
| 0.8937499999999999 | 0 |
| 0.8944444444444444 | 0 |
| 0.8951388888888889 | 0 |
| 0.8958333333333334 | 0 |
| 0.8965277777777777 | 0 |
| 0.8972222222222223 | 0 |
| 0.8979166666666667 | 0 |
| 0.8986111111111111 | 0 |
| 0.8993055555555555 | 0 |
| 0.9 | 0 |
| 0.9006944444444445 | 0 |
| 0.9013888888888889 | 0 |
| 0.9020833333333332 | 0 |
| 0.9027777777777778 | 0 |
| 0.9034722222222222 | 0 |
| 0.9041666666666667 | 0 |
| 0.904861111111111 | 0 |
| 0.9055555555555556 | 0 |
| 0.90625 | 0 |
| 0.9069444444444444 | 0 |
| 0.907638888888889 | 0 |
| 0.9083333333333333 | 0 |
| 0.9090277777777778 | 0 |
| 0.9097222222222222 | 0 |
| 0.9104166666666668 | 0 |
| 0.9111111111111111 | 0 |
| 0.9118055555555555 | 0 |
| 0.9125 | 0 |
| 0.9131944444444445 | 0 |
| 0.9138888888888889 | 0 |
| 0.9145833333333333 | 0 |
| 0.9152777777777777 | 0 |
| 0.9159722222222223 | 0 |
| 0.9166666666666666 | 0 |
| 0.9173611111111111 | 0 |
| 0.9180555555555556 | 0 |
| 0.9187500000000001 | 0 |
| 0.9194444444444444 | 0 |
| 0.9201388888888888 | 0 |
| 0.9208333333333334 | 0 |
| 0.9215277777777778 | 0 |
| 0.9222222222222222 | 0 |
| 0.9229166666666666 | 0 |
| 0.9236111111111112 | 0 |
| 0.9243055555555556 | 0 |
| 0.9249999999999999 | 0 |
| 0.9256944444444444 | 0 |
| 0.9263888888888889 | 0 |
| 0.9270833333333334 | 0 |
| 0.9277777777777777 | 0 |
| 0.9284722222222223 | 0 |
| 0.9291666666666667 | 0 |
| 0.9298611111111111 | 0 |
| 0.9305555555555555 | 0 |
| 0.93125 | 0 |
| 0.9319444444444445 | 0 |
| 0.9326388888888889 | 0 |
| 0.9333333333333332 | 0 |
| 0.9340277777777778 | 0 |
| 0.9347222222222222 | 0 |
| 0.9354166666666667 | 0 |
| 0.936111111111111 | 0 |
| 0.9368055555555556 | 0 |
| 0.9375 | 0 |
| 0.9381944444444444 | 0 |
| 0.938888888888889 | 0 |
| 0.9395833333333333 | 0 |
| 0.9402777777777778 | 0 |
| 0.9409722222222222 | 0 |
| 0.9416666666666668 | 0 |
| 0.9423611111111111 | 0 |
| 0.9430555555555555 | 0 |
| 0.94375 | 0 |
| 0.9444444444444445 | 0 |
| 0.9451388888888889 | 0 |
| 0.9458333333333333 | 0 |
| 0.9465277777777777 | 0 |
| 0.9472222222222223 | 0 |
| 0.9479166666666666 | 0 |
| 0.9486111111111111 | 0 |
| 0.9493055555555556 | 0 |
| 0.9500000000000001 | 0 |
| 0.9506944444444444 | 0 |
| 0.9513888888888888 | 0 |
| 0.9520833333333334 | 0 |
| 0.9527777777777778 | 0 |
| 0.9534722222222222 | 0 |
| 0.9541666666666666 | 0 |
| 0.9548611111111112 | 0 |
| 0.9555555555555556 | 0 |
| 0.9562499999999999 | 0 |
| 0.9569444444444444 | 0 |
| 0.9576388888888889 | 0 |
| 0.9583333333333334 | 0 |
| 0.9590277777777777 | 0 |
| 0.9597222222222223 | 0 |
| 0.9604166666666667 | 0 |
| 0.9611111111111111 | 0 |
| 0.9618055555555555 | 0 |
| 0.9625 | 0 |
| 0.9631944444444445 | 0 |
| 0.9638888888888889 | 0 |
| 0.9645833333333332 | 0 |
| 0.9652777777777778 | 0 |
| 0.9659722222222222 | 0 |
| 0.9666666666666667 | 0 |
| 0.967361111111111 | 0 |
| 0.9680555555555556 | 0 |
| 0.96875 | 0 |
| 0.9694444444444444 | 0 |
| 0.970138888888889 | 0 |
| 0.9708333333333333 | 0 |
| 0.9715277777777778 | 0 |
| 0.9722222222222222 | 0 |
| 0.9729166666666668 | 0 |
| 0.9736111111111111 | 0 |
| 0.9743055555555555 | 0 |
| 0.975 | 0 |
| 0.9756944444444445 | 0 |
| 0.9763888888888889 | 0 |
| 0.9770833333333333 | 0 |
| 0.9777777777777777 | 0 |
| 0.9784722222222223 | 0 |
| 0.9791666666666666 | 0 |
| 0.9798611111111111 | 0 |
| 0.9805555555555556 | 0 |
| 0.9812500000000001 | 0 |
| 0.9819444444444444 | 0 |
| 0.9826388888888888 | 0 |
| 0.9833333333333334 | 0 |
| 0.9840277777777778 | 0 |
| 0.9847222222222222 | 0 |
| 0.9854166666666666 | 0 |
| 0.9861111111111112 | 0 |
| 0.9868055555555556 | 0 |
| 0.9874999999999999 | 0 |
| 0.9881944444444444 | 0 |
| 0.9888888888888889 | 0 |
| 0.9895833333333334 | 0 |
| 0.9902777777777777 | 0 |
| 0.9909722222222223 | 0 |
| 0.9916666666666667 | 0 |
| 0.9923611111111111 | 0 |
| 0.9930555555555555 | 0 |
| 0.99375 | 0 |
| 0.9944444444444445 | 0 |
| 0.9951388888888889 | 0 |
| 0.9958333333333332 | 0 |
| 0.9965277777777778 | 0 |
| 0.9972222222222222 | 0 |
| 0.9979166666666667 | 0 |
| 0.998611111111111 | 0 |
| 0.9993055555555556 | 0 |